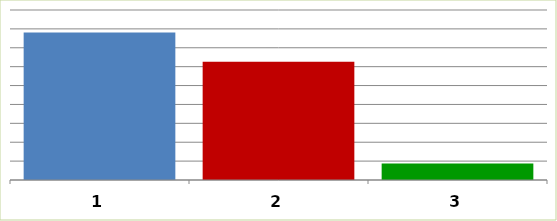
| Category | Series 0 |
|---|---|
| 0 | 1562799130.42 |
| 1 | 1251090042.63 |
| 2 | 176000000 |